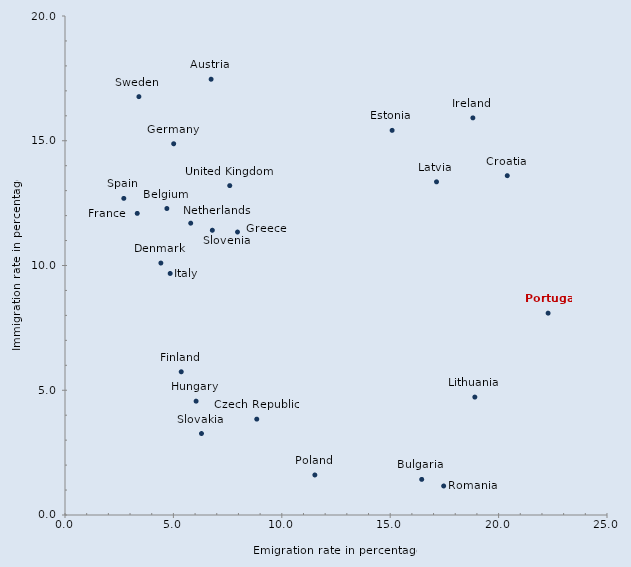
| Category | Series 0 |
|---|---|
| 6.739097716378535 | 17.466 |
| 4.699362573890239 | 12.284 |
| 16.45349714613876 | 1.428 |
| 20.4 | 13.6 |
| 8.845352818398537 | 3.842 |
| 4.421792526866347 | 10.099 |
| 15.088247528871104 | 15.416 |
| 5.36166631264676 | 5.74 |
| 3.3325001985780185 | 12.088 |
| 5.0136125270321825 | 14.879 |
| 7.956855086763873 | 11.342 |
| 6.047038144913513 | 4.562 |
| 18.812596446811483 | 15.917 |
| 4.851231280943401 | 9.681 |
| 17.136639731073743 | 13.353 |
| 18.903524695100238 | 4.726 |
| 5.798748107008307 | 11.696 |
| 11.524429556419989 | 1.604 |
| 22.28371883020382 | 8.09 |
| 17.467384581384636 | 1.163 |
| 6.295682954994031 | 3.265 |
| 6.795077788622732 | 11.413 |
| 2.712397910580007 | 12.69 |
| 3.4094843603295333 | 16.768 |
| 7.598545085041816 | 13.201 |